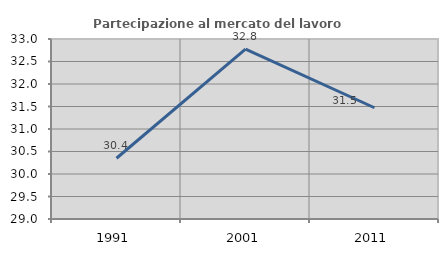
| Category | Partecipazione al mercato del lavoro  femminile |
|---|---|
| 1991.0 | 30.35 |
| 2001.0 | 32.773 |
| 2011.0 | 31.472 |